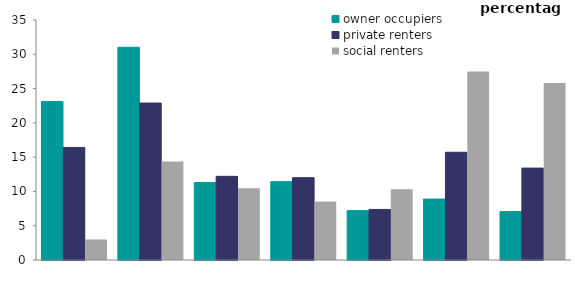
| Category | owner occupiers | private renters | social renters |
|---|---|---|---|
| higher 
managerial/
professional | 23.118 | 16.415 | 2.995 |
| lower 
managerial/
professional | 31.025 | 22.893 | 14.376 |
| intermediate 
occupations | 11.292 | 12.199 | 10.463 |
| small employers/
own account 
workers | 11.43 | 12.005 | 8.523 |
| lower 
supervisory/
technical | 7.196 | 7.372 | 10.323 |
| semi-routine occupations | 8.884 | 15.712 | 27.498 |
| routine 
occupations | 7.055 | 13.404 | 25.822 |